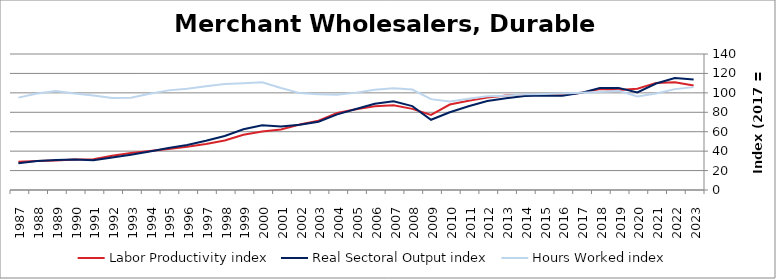
| Category | Labor Productivity index | Real Sectoral Output index | Hours Worked index |
|---|---|---|---|
| 2023.0 | 107.492 | 113.835 | 105.902 |
| 2022.0 | 110.991 | 115.265 | 103.851 |
| 2021.0 | 110.256 | 109.596 | 99.402 |
| 2020.0 | 104.338 | 100.435 | 96.259 |
| 2019.0 | 102.965 | 105.114 | 102.088 |
| 2018.0 | 103.918 | 104.958 | 101.001 |
| 2017.0 | 100 | 100 | 100 |
| 2016.0 | 97.81 | 97.081 | 99.254 |
| 2015.0 | 98.442 | 97.331 | 98.872 |
| 2014.0 | 98.167 | 96.81 | 98.618 |
| 2013.0 | 97.331 | 94.512 | 97.103 |
| 2012.0 | 95.09 | 91.669 | 96.403 |
| 2011.0 | 91.853 | 86.247 | 93.897 |
| 2010.0 | 87.996 | 80.082 | 91.006 |
| 2009.0 | 77.309 | 72.308 | 93.53 |
| 2008.0 | 83.539 | 86.398 | 103.421 |
| 2007.0 | 87.193 | 91.249 | 104.652 |
| 2006.0 | 86.131 | 88.849 | 103.155 |
| 2005.0 | 83.108 | 83.309 | 100.241 |
| 2004.0 | 79.381 | 77.874 | 98.101 |
| 2003.0 | 71.239 | 70.253 | 98.617 |
| 2002.0 | 67.405 | 67.223 | 99.73 |
| 2001.0 | 62.257 | 65.364 | 104.99 |
| 2000.0 | 60.201 | 66.724 | 110.836 |
| 1999.0 | 56.85 | 62.503 | 109.944 |
| 1998.0 | 50.903 | 55.528 | 109.086 |
| 1997.0 | 47.357 | 50.608 | 106.864 |
| 1996.0 | 44.49 | 46.39 | 104.272 |
| 1995.0 | 42.194 | 43.274 | 102.559 |
| 1994.0 | 40.036 | 39.639 | 99.008 |
| 1993.0 | 38.174 | 36.221 | 94.883 |
| 1992.0 | 35.345 | 33.473 | 94.705 |
| 1991.0 | 31.607 | 30.74 | 97.258 |
| 1990.0 | 31.521 | 31.32 | 99.36 |
| 1989.0 | 30.321 | 30.907 | 101.931 |
| 1988.0 | 29.954 | 29.776 | 99.404 |
| 1987.0 | 29.057 | 27.628 | 95.082 |